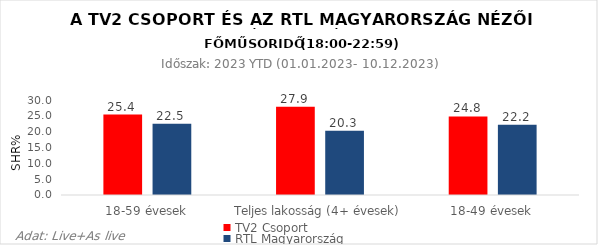
| Category | TV2 Csoport | RTL Magyarország |
|---|---|---|
| 18-59 évesek | 25.4 | 22.5 |
| Teljes lakosság (4+ évesek) | 27.9 | 20.3 |
| 18-49 évesek | 24.8 | 22.2 |